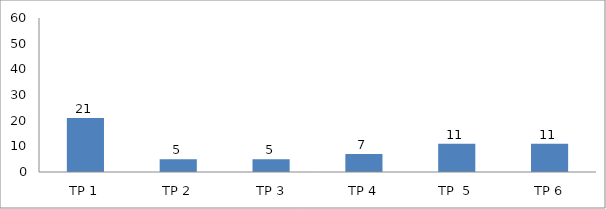
| Category | BIL. MURID |
|---|---|
| TP 1 | 21 |
| TP 2 | 5 |
|  TP 3 | 5 |
| TP 4 | 7 |
| TP  5 | 11 |
| TP 6 | 11 |